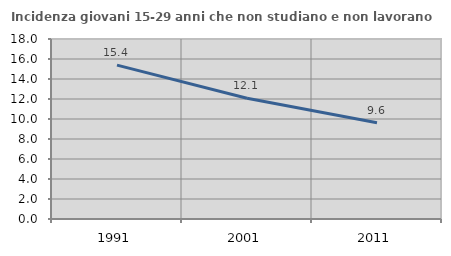
| Category | Incidenza giovani 15-29 anni che non studiano e non lavorano  |
|---|---|
| 1991.0 | 15.385 |
| 2001.0 | 12.069 |
| 2011.0 | 9.615 |